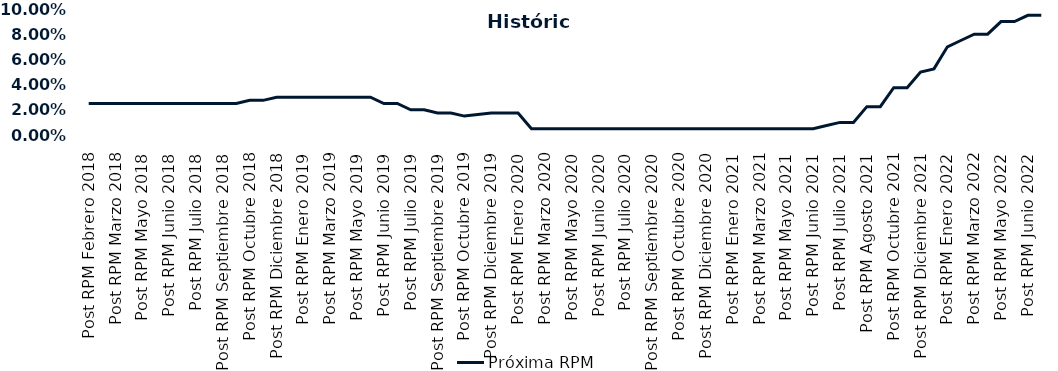
| Category | Próxima RPM |
|---|---|
| Post RPM Febrero 2018 | 0.025 |
| Pre RPM Marzo 2018 | 0.025 |
| Post RPM Marzo 2018 | 0.025 |
| Pre RPM Mayo 2018 | 0.025 |
| Post RPM Mayo 2018 | 0.025 |
| Pre RPM Junio 2018 | 0.025 |
| Post RPM Junio 2018 | 0.025 |
| Pre RPM Julio 2018 | 0.025 |
| Post RPM Julio 2018 | 0.025 |
| Pre RPM Septiembre 2018 | 0.025 |
| Post RPM Septiembre 2018 | 0.025 |
| Pre RPM Octubre 2018 | 0.025 |
| Post RPM Octubre 2018 | 0.028 |
| Pre RPM Diciembre 2018 | 0.028 |
| Post RPM Diciembre 2018 | 0.03 |
| Pre RPM Enero 2019 | 0.03 |
| Post RPM Enero 2019 | 0.03 |
| Pre RPM Marzo 2019 | 0.03 |
| Post RPM Marzo 2019 | 0.03 |
| Pre RPM Mayo 2019 | 0.03 |
| Post RPM Mayo 2019 | 0.03 |
| Pre RPM Junio 2019 | 0.03 |
| Post RPM Junio 2019 | 0.025 |
| Pre RPM Julio 2019 | 0.025 |
| Post RPM Julio 2019 | 0.02 |
| Pre RPM Septiembre 2019 | 0.02 |
| Post RPM Septiembre 2019 | 0.018 |
| Pre RPM Octubre 2019 | 0.018 |
| Post RPM Octubre 2019 | 0.015 |
| Pre RPM Diciembre 2019 | 0.016 |
| Post RPM Diciembre 2019 | 0.018 |
| Pre RPM Enero 2020 | 0.018 |
| Post RPM Enero 2020 | 0.018 |
| Pre RPM Marzo 2020 | 0.005 |
| Post RPM Marzo 2020 | 0.005 |
| Pre RPM Mayo 2020 | 0.005 |
| Post RPM Mayo 2020 | 0.005 |
| Pre RPM Junio 2020 | 0.005 |
| Post RPM Junio 2020 | 0.005 |
| Pre RPM Julio 2020 | 0.005 |
| Post RPM Julio 2020 | 0.005 |
| Pre RPM Septiembre 2020 | 0.005 |
| Post RPM Septiembre 2020 | 0.005 |
| Pre RPM Octubre 2020 | 0.005 |
| Post RPM Octubre 2020 | 0.005 |
| Pre RPM Diciembre 2020 | 0.005 |
| Post RPM Diciembre 2020 | 0.005 |
| Pre RPM Enero 2021 | 0.005 |
| Post RPM Enero 2021 | 0.005 |
| Pre RPM Marzo 2021 | 0.005 |
| Post RPM Marzo 2021 | 0.005 |
| Pre RPM Mayo 2021 | 0.005 |
| Post RPM Mayo 2021 | 0.005 |
| Pre RPM Junio 2021 | 0.005 |
| Post RPM Junio 2021 | 0.005 |
| Pre RPM Julio 2021 | 0.008 |
| Post RPM Julio 2021 | 0.01 |
| Pre RPM Agosto 2021 | 0.01 |
| Post RPM Agosto 2021 | 0.022 |
| Pre RPM Octubre 2021 | 0.022 |
| Post RPM Octubre 2021 | 0.038 |
| Pre RPM Diciembre 2021 | 0.038 |
| Post RPM Diciembre 2021 | 0.05 |
| Pre RPM Enero 2022 | 0.052 |
| Post RPM Enero 2022 | 0.07 |
| Pre RPM Marzo 2022 | 0.075 |
| Post RPM Marzo 2022 | 0.08 |
| Pre RPM Mayo 2022 | 0.08 |
| Post RPM Mayo 2022 | 0.09 |
| Pre RPM Junio 2022 | 0.09 |
| Post RPM Junio 2022 | 0.095 |
| Pre RPM Julio 2022 | 0.095 |